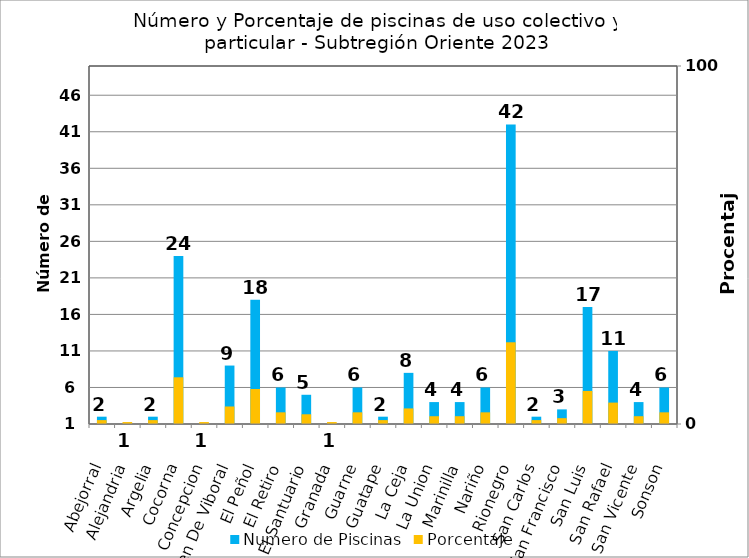
| Category | Numero de Piscinas |
|---|---|
| Abejorral | 2 |
| Alejandria | 1 |
| Argelia | 2 |
| Cocorna | 24 |
| Concepcion | 1 |
| El Carmen De Viboral | 9 |
| El Peñol | 18 |
| El Retiro | 6 |
| El Santuario | 5 |
| Granada | 1 |
| Guarne | 6 |
| Guatape | 2 |
| La Ceja | 8 |
| La Union | 4 |
| Marinilla | 4 |
| Nariño | 6 |
| Rionegro | 42 |
| San Carlos | 2 |
| San Francisco | 3 |
| San Luis | 17 |
| San Rafael | 11 |
| San Vicente | 4 |
| Sonson | 6 |